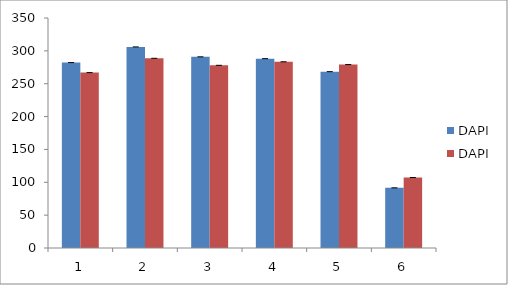
| Category | DAPI |
|---|---|
| 0 | 266.889 |
| 1 | 288.667 |
| 2 | 278 |
| 3 | 283.333 |
| 4 | 279.111 |
| 5 | 107.222 |